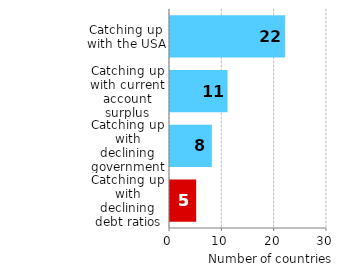
| Category | Országok száma |
|---|---|
| Catching up with declining debt ratios and current account surplus | 5 |
| Catching up with declining government debt ratios | 8 |
| Catching up with current account surplus | 11 |
| Catching up with the USA | 22 |